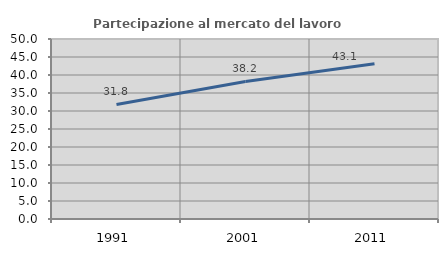
| Category | Partecipazione al mercato del lavoro  femminile |
|---|---|
| 1991.0 | 31.818 |
| 2001.0 | 38.196 |
| 2011.0 | 43.136 |